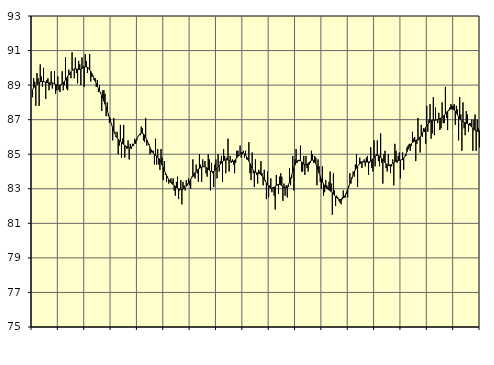
| Category | Piggar | Series 1 |
|---|---|---|
| nan | 88.3 | 88.73 |
| 87.0 | 89.4 | 88.86 |
| 87.0 | 89.2 | 88.9 |
| 87.0 | 87.8 | 88.96 |
| 87.0 | 89.7 | 89.03 |
| 87.0 | 89.4 | 89.09 |
| 87.0 | 87.8 | 89.15 |
| 87.0 | 90.2 | 89.18 |
| 87.0 | 89.5 | 89.21 |
| 87.0 | 88.9 | 89.21 |
| 87.0 | 90 | 89.2 |
| 87.0 | 89.2 | 89.18 |
| nan | 88.2 | 89.16 |
| 88.0 | 89.3 | 89.15 |
| 88.0 | 89.4 | 89.14 |
| 88.0 | 88.7 | 89.13 |
| 88.0 | 89 | 89.13 |
| 88.0 | 89.8 | 89.13 |
| 88.0 | 88.8 | 89.13 |
| 88.0 | 89.1 | 89.11 |
| 88.0 | 89.8 | 89.08 |
| 88.0 | 88.5 | 89.05 |
| 88.0 | 88.7 | 89.02 |
| 88.0 | 89.5 | 88.99 |
| nan | 88.7 | 88.99 |
| 89.0 | 88.6 | 89 |
| 89.0 | 89 | 89.03 |
| 89.0 | 89.8 | 89.07 |
| 89.0 | 88.7 | 89.14 |
| 89.0 | 89 | 89.21 |
| 89.0 | 90.6 | 89.31 |
| 89.0 | 88.8 | 89.41 |
| 89.0 | 88.7 | 89.51 |
| 89.0 | 89.9 | 89.61 |
| 89.0 | 89.6 | 89.7 |
| 89.0 | 89.4 | 89.78 |
| nan | 90.9 | 89.85 |
| 90.0 | 89.9 | 89.9 |
| 90.0 | 89.4 | 89.93 |
| 90.0 | 90.6 | 89.94 |
| 90.0 | 89.7 | 89.94 |
| 90.0 | 89.1 | 89.92 |
| 90.0 | 90.4 | 89.91 |
| 90.0 | 90.2 | 89.9 |
| 90.0 | 89 | 89.92 |
| 90.0 | 90.6 | 89.96 |
| 90.0 | 90.1 | 90 |
| 90.0 | 88.9 | 90.04 |
| nan | 90.8 | 90.06 |
| 91.0 | 90.4 | 90.06 |
| 91.0 | 89.7 | 90.03 |
| 91.0 | 90 | 89.97 |
| 91.0 | 90.8 | 89.89 |
| 91.0 | 89.2 | 89.79 |
| 91.0 | 89.5 | 89.67 |
| 91.0 | 89.5 | 89.54 |
| 91.0 | 89.3 | 89.39 |
| 91.0 | 89.4 | 89.24 |
| 91.0 | 88.9 | 89.08 |
| 91.0 | 89.3 | 88.94 |
| nan | 88.6 | 88.8 |
| 92.0 | 89 | 88.67 |
| 92.0 | 88.6 | 88.53 |
| 92.0 | 87.5 | 88.39 |
| 92.0 | 88.7 | 88.24 |
| 92.0 | 88.7 | 88.08 |
| 92.0 | 88.5 | 87.9 |
| 92.0 | 87.2 | 87.72 |
| 92.0 | 88 | 87.54 |
| 92.0 | 87.2 | 87.34 |
| 92.0 | 86.8 | 87.13 |
| 92.0 | 87.1 | 86.93 |
| nan | 86.7 | 86.72 |
| 93.0 | 85.8 | 86.52 |
| 93.0 | 87.1 | 86.34 |
| 93.0 | 86.3 | 86.19 |
| 93.0 | 86 | 86.06 |
| 93.0 | 86.3 | 85.96 |
| 93.0 | 85 | 85.87 |
| 93.0 | 85.5 | 85.8 |
| 93.0 | 86.7 | 85.74 |
| 93.0 | 84.8 | 85.68 |
| 93.0 | 85.9 | 85.62 |
| 93.0 | 86.7 | 85.57 |
| nan | 84.8 | 85.51 |
| 94.0 | 85.4 | 85.46 |
| 94.0 | 85.3 | 85.42 |
| 94.0 | 85.8 | 85.39 |
| 94.0 | 84.7 | 85.37 |
| 94.0 | 85.6 | 85.37 |
| 94.0 | 85.3 | 85.41 |
| 94.0 | 85.6 | 85.48 |
| 94.0 | 85.5 | 85.57 |
| 94.0 | 85.9 | 85.67 |
| 94.0 | 85.6 | 85.79 |
| 94.0 | 85.8 | 85.9 |
| nan | 86 | 86.01 |
| 95.0 | 86.1 | 86.11 |
| 95.0 | 86.1 | 86.18 |
| 95.0 | 86.6 | 86.22 |
| 95.0 | 86.5 | 86.22 |
| 95.0 | 85.8 | 86.18 |
| 95.0 | 85.7 | 86.1 |
| 95.0 | 87.1 | 85.98 |
| 95.0 | 85.5 | 85.83 |
| 95.0 | 85.7 | 85.68 |
| 95.0 | 85.6 | 85.53 |
| 95.0 | 85 | 85.38 |
| nan | 85.1 | 85.25 |
| 96.0 | 85.2 | 85.15 |
| 96.0 | 85.2 | 85.06 |
| 96.0 | 84.4 | 85 |
| 96.0 | 85.9 | 84.94 |
| 96.0 | 84.4 | 84.89 |
| 96.0 | 85.3 | 84.83 |
| 96.0 | 84.4 | 84.76 |
| 96.0 | 84.1 | 84.65 |
| 96.0 | 85.3 | 84.53 |
| 96.0 | 84.8 | 84.38 |
| 96.0 | 83.5 | 84.23 |
| nan | 84.6 | 84.07 |
| 97.0 | 83.8 | 83.92 |
| 97.0 | 83.4 | 83.78 |
| 97.0 | 83.7 | 83.65 |
| 97.0 | 83.3 | 83.53 |
| 97.0 | 83.5 | 83.44 |
| 97.0 | 83.6 | 83.36 |
| 97.0 | 83.4 | 83.3 |
| 97.0 | 83.6 | 83.24 |
| 97.0 | 82.9 | 83.19 |
| 97.0 | 82.6 | 83.14 |
| 97.0 | 83.4 | 83.08 |
| nan | 83.7 | 83.04 |
| 98.0 | 82.4 | 83 |
| 98.0 | 82.9 | 82.97 |
| 98.0 | 83.5 | 82.96 |
| 98.0 | 82.1 | 82.96 |
| 98.0 | 83.4 | 82.98 |
| 98.0 | 83.2 | 83.02 |
| 98.0 | 82.9 | 83.07 |
| 98.0 | 83.5 | 83.14 |
| 98.0 | 83.3 | 83.22 |
| 98.0 | 83.6 | 83.32 |
| 98.0 | 83.2 | 83.43 |
| nan | 83 | 83.54 |
| 99.0 | 83.7 | 83.65 |
| 99.0 | 84.7 | 83.76 |
| 99.0 | 83.7 | 83.85 |
| 99.0 | 83.6 | 83.94 |
| 99.0 | 84.4 | 84.02 |
| 99.0 | 83.9 | 84.08 |
| 99.0 | 83.4 | 84.14 |
| 99.0 | 85 | 84.18 |
| 99.0 | 84.4 | 84.22 |
| 99.0 | 83.4 | 84.25 |
| 99.0 | 84.7 | 84.27 |
| nan | 84.3 | 84.28 |
| 0.0 | 84.6 | 84.27 |
| 0.0 | 83.9 | 84.24 |
| 0.0 | 83.7 | 84.19 |
| 0.0 | 85 | 84.13 |
| 0.0 | 84.7 | 84.07 |
| 0.0 | 82.9 | 84.02 |
| 0.0 | 84.5 | 84 |
| 0.0 | 83.9 | 83.99 |
| 0.0 | 83.1 | 84.01 |
| 0.0 | 84.4 | 84.05 |
| 0.0 | 84.7 | 84.12 |
| nan | 83.6 | 84.19 |
| 1.0 | 85 | 84.27 |
| 1.0 | 84 | 84.35 |
| 1.0 | 84.6 | 84.43 |
| 1.0 | 84.9 | 84.5 |
| 1.0 | 83.4 | 84.56 |
| 1.0 | 85.3 | 84.62 |
| 1.0 | 84.9 | 84.66 |
| 1.0 | 83.9 | 84.68 |
| 1.0 | 84.8 | 84.68 |
| 1.0 | 85.9 | 84.67 |
| 1.0 | 84 | 84.64 |
| nan | 84.9 | 84.61 |
| 2.0 | 84.5 | 84.59 |
| 2.0 | 84.7 | 84.59 |
| 2.0 | 84.4 | 84.6 |
| 2.0 | 83.9 | 84.65 |
| 2.0 | 84.5 | 84.71 |
| 2.0 | 85.2 | 84.79 |
| 2.0 | 85.2 | 84.88 |
| 2.0 | 84.9 | 84.96 |
| 2.0 | 85.5 | 85.04 |
| 2.0 | 84.8 | 85.08 |
| 2.0 | 85 | 85.1 |
| nan | 85.2 | 85.08 |
| 3.0 | 84.8 | 85.03 |
| 3.0 | 85.2 | 84.95 |
| 3.0 | 84.7 | 84.85 |
| 3.0 | 84.7 | 84.73 |
| 3.0 | 85.7 | 84.6 |
| 3.0 | 83.9 | 84.46 |
| 3.0 | 83.5 | 84.32 |
| 3.0 | 85.1 | 84.19 |
| 3.0 | 83.9 | 84.08 |
| 3.0 | 83.1 | 84 |
| 3.0 | 84.7 | 83.95 |
| nan | 83.8 | 83.93 |
| 4.0 | 83.3 | 83.91 |
| 4.0 | 84.1 | 83.9 |
| 4.0 | 84 | 83.87 |
| 4.0 | 84.6 | 83.82 |
| 4.0 | 83.9 | 83.75 |
| 4.0 | 83.2 | 83.66 |
| 4.0 | 84.1 | 83.56 |
| 4.0 | 83.5 | 83.45 |
| 4.0 | 82.4 | 83.33 |
| 4.0 | 84 | 83.23 |
| 4.0 | 82.5 | 83.14 |
| nan | 83.2 | 83.07 |
| 5.0 | 83.6 | 83.03 |
| 5.0 | 82.8 | 83.02 |
| 5.0 | 83.1 | 83.05 |
| 5.0 | 82.6 | 83.08 |
| 5.0 | 81.8 | 83.14 |
| 5.0 | 83.8 | 83.19 |
| 5.0 | 83.2 | 83.23 |
| 5.0 | 82.7 | 83.25 |
| 5.0 | 83.7 | 83.25 |
| 5.0 | 83.9 | 83.23 |
| 5.0 | 83.7 | 83.18 |
| nan | 82.3 | 83.14 |
| 6.0 | 83.3 | 83.09 |
| 6.0 | 82.6 | 83.06 |
| 6.0 | 83.2 | 83.07 |
| 6.0 | 82.5 | 83.12 |
| 6.0 | 83.1 | 83.23 |
| 6.0 | 84.2 | 83.38 |
| 6.0 | 83.2 | 83.57 |
| 6.0 | 83.6 | 83.79 |
| 6.0 | 84.9 | 84.01 |
| 6.0 | 82.9 | 84.22 |
| 6.0 | 84.7 | 84.38 |
| nan | 85.3 | 84.52 |
| 7.0 | 84.5 | 84.61 |
| 7.0 | 84.6 | 84.65 |
| 7.0 | 84.6 | 84.65 |
| 7.0 | 85.5 | 84.62 |
| 7.0 | 84 | 84.56 |
| 7.0 | 84 | 84.49 |
| 7.0 | 84.9 | 84.42 |
| 7.0 | 83.8 | 84.39 |
| 7.0 | 84.9 | 84.38 |
| 7.0 | 84.2 | 84.41 |
| 7.0 | 84 | 84.46 |
| nan | 84.4 | 84.53 |
| 8.0 | 84.5 | 84.59 |
| 8.0 | 85.2 | 84.64 |
| 8.0 | 85 | 84.66 |
| 8.0 | 84.5 | 84.63 |
| 8.0 | 84.9 | 84.56 |
| 8.0 | 84.8 | 84.45 |
| 8.0 | 83.2 | 84.3 |
| 8.0 | 84.7 | 84.12 |
| 8.0 | 84.3 | 83.92 |
| 8.0 | 83.4 | 83.73 |
| 8.0 | 83 | 83.56 |
| nan | 84.3 | 83.41 |
| 9.0 | 82.6 | 83.28 |
| 9.0 | 82.8 | 83.18 |
| 9.0 | 83.5 | 83.09 |
| 9.0 | 83.2 | 83.03 |
| 9.0 | 83.1 | 82.98 |
| 9.0 | 83.4 | 82.94 |
| 9.0 | 84 | 82.89 |
| 9.0 | 83.3 | 82.84 |
| 9.0 | 81.5 | 82.77 |
| 9.0 | 83.9 | 82.7 |
| 9.0 | 82.9 | 82.62 |
| nan | 82 | 82.55 |
| 10.0 | 82.6 | 82.48 |
| 10.0 | 82.5 | 82.43 |
| 10.0 | 82.3 | 82.39 |
| 10.0 | 82.2 | 82.37 |
| 10.0 | 82.1 | 82.37 |
| 10.0 | 82.5 | 82.4 |
| 10.0 | 82.9 | 82.46 |
| 10.0 | 82.5 | 82.55 |
| 10.0 | 82.5 | 82.66 |
| 10.0 | 82.7 | 82.81 |
| 10.0 | 82.5 | 82.97 |
| nan | 83.1 | 83.14 |
| 11.0 | 83.9 | 83.32 |
| 11.0 | 83.3 | 83.49 |
| 11.0 | 83.6 | 83.66 |
| 11.0 | 84 | 83.83 |
| 11.0 | 83.7 | 83.97 |
| 11.0 | 84.4 | 84.1 |
| 11.0 | 85 | 84.21 |
| 11.0 | 83.1 | 84.3 |
| 11.0 | 84.4 | 84.38 |
| 11.0 | 84.8 | 84.44 |
| 11.0 | 84.6 | 84.49 |
| nan | 84.2 | 84.53 |
| 12.0 | 84.6 | 84.55 |
| 12.0 | 84.7 | 84.56 |
| 12.0 | 84.3 | 84.56 |
| 12.0 | 84.8 | 84.55 |
| 12.0 | 84.9 | 84.55 |
| 12.0 | 83.8 | 84.55 |
| 12.0 | 84.5 | 84.56 |
| 12.0 | 85.4 | 84.6 |
| 12.0 | 84.2 | 84.67 |
| 12.0 | 84 | 84.74 |
| 12.0 | 85.8 | 84.82 |
| nan | 84.3 | 84.88 |
| 13.0 | 85 | 84.92 |
| 13.0 | 85.8 | 84.94 |
| 13.0 | 84.6 | 84.92 |
| 13.0 | 84.3 | 84.89 |
| 13.0 | 86.2 | 84.83 |
| 13.0 | 84.5 | 84.76 |
| 13.0 | 83.3 | 84.68 |
| 13.0 | 85 | 84.6 |
| 13.0 | 85.2 | 84.51 |
| 13.0 | 84.2 | 84.44 |
| 13.0 | 84 | 84.38 |
| nan | 85 | 84.35 |
| 14.0 | 84.4 | 84.35 |
| 14.0 | 83.9 | 84.37 |
| 14.0 | 84.3 | 84.41 |
| 14.0 | 84.7 | 84.46 |
| 14.0 | 83.2 | 84.52 |
| 14.0 | 85.6 | 84.56 |
| 14.0 | 85.2 | 84.6 |
| 14.0 | 84.5 | 84.63 |
| 14.0 | 84.9 | 84.64 |
| 14.0 | 85.1 | 84.65 |
| 14.0 | 83.6 | 84.65 |
| nan | 84.7 | 84.67 |
| 15.0 | 85.1 | 84.7 |
| 15.0 | 84.1 | 84.77 |
| 15.0 | 84.9 | 84.88 |
| 15.0 | 84.9 | 85.01 |
| 15.0 | 85.4 | 85.15 |
| 15.0 | 85.5 | 85.3 |
| 15.0 | 85.6 | 85.43 |
| 15.0 | 85.2 | 85.54 |
| 15.0 | 85.5 | 85.62 |
| 15.0 | 86.3 | 85.68 |
| 15.0 | 85.9 | 85.72 |
| nan | 86 | 85.76 |
| 16.0 | 84.6 | 85.79 |
| 16.0 | 85.6 | 85.83 |
| 16.0 | 87.1 | 85.87 |
| 16.0 | 85.8 | 85.93 |
| 16.0 | 85.1 | 86.01 |
| 16.0 | 86.7 | 86.1 |
| 16.0 | 86 | 86.21 |
| 16.0 | 86.5 | 86.33 |
| 16.0 | 86.3 | 86.44 |
| 16.0 | 85.6 | 86.55 |
| 16.0 | 87.8 | 86.64 |
| nan | 86.3 | 86.73 |
| 17.0 | 87 | 86.81 |
| 17.0 | 87.9 | 86.88 |
| 17.0 | 85.9 | 86.93 |
| 17.0 | 86.2 | 86.96 |
| 17.0 | 88.3 | 86.97 |
| 17.0 | 86.1 | 86.97 |
| 17.0 | 87.7 | 86.97 |
| 17.0 | 87 | 86.98 |
| 17.0 | 86.8 | 87 |
| 17.0 | 87.4 | 87.03 |
| 17.0 | 86.4 | 87.06 |
| nan | 86.5 | 87.1 |
| 18.0 | 88 | 87.14 |
| 18.0 | 86.8 | 87.2 |
| 18.0 | 86.8 | 87.26 |
| 18.0 | 88.9 | 87.34 |
| 18.0 | 87.1 | 87.42 |
| 18.0 | 86.4 | 87.5 |
| 18.0 | 87.5 | 87.56 |
| 18.0 | 87.7 | 87.6 |
| 18.0 | 87.9 | 87.62 |
| 18.0 | 87.8 | 87.63 |
| 18.0 | 87.8 | 87.61 |
| nan | 87.9 | 87.56 |
| 19.0 | 86.7 | 87.49 |
| 19.0 | 87.8 | 87.39 |
| 19.0 | 87.6 | 87.28 |
| 19.0 | 85.8 | 87.17 |
| 19.0 | 88.3 | 87.05 |
| 19.0 | 87.3 | 86.97 |
| 19.0 | 85.2 | 86.92 |
| 19.0 | 88 | 86.88 |
| 19.0 | 86.5 | 86.85 |
| 19.0 | 86.1 | 86.82 |
| 19.0 | 87.5 | 86.8 |
| nan | 87.3 | 86.77 |
| 20.0 | 86.3 | 86.73 |
| 20.0 | 86.8 | 86.69 |
| 20.0 | 86.8 | 86.64 |
| 20.0 | 87 | 86.57 |
| 20.0 | 85.2 | 86.51 |
| 20.0 | 87 | 86.44 |
| 20.0 | 87.3 | 86.39 |
| 20.0 | 85.2 | 86.35 |
| 20.0 | 87 | 86.33 |
| 20.0 | 86.5 | 86.33 |
| 20.0 | 85.4 | 86.36 |